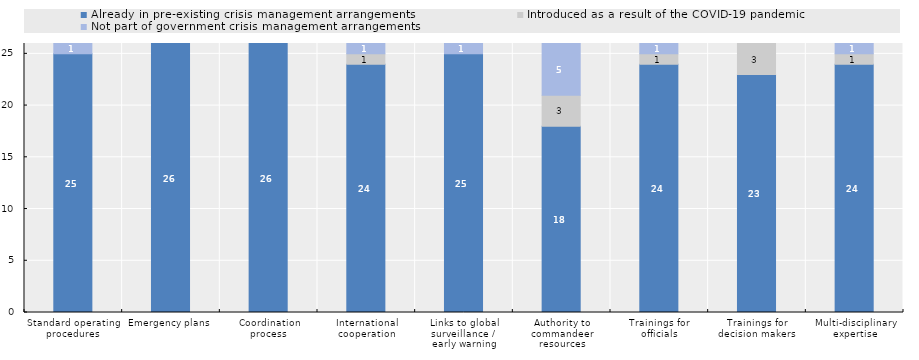
| Category | Already in pre-existing crisis management arrangements | Introduced as a result of the COVID-19 pandemic | Not part of government crisis management arrangements |
|---|---|---|---|
| Standard operating procedures | 25 | 0 | 1 |
| Emergency plans | 26 | 0 | 0 |
| Coordination process | 26 | 0 | 0 |
| International cooperation | 24 | 1 | 1 |
| Links to global surveillance / 
early warning | 25 | 0 | 1 |
| Authority to commandeer resources | 18 | 3 | 5 |
| Trainings for officials | 24 | 1 | 1 |
| Trainings for decision makers | 23 | 3 | 0 |
| Multi-disciplinary expertise | 24 | 1 | 1 |